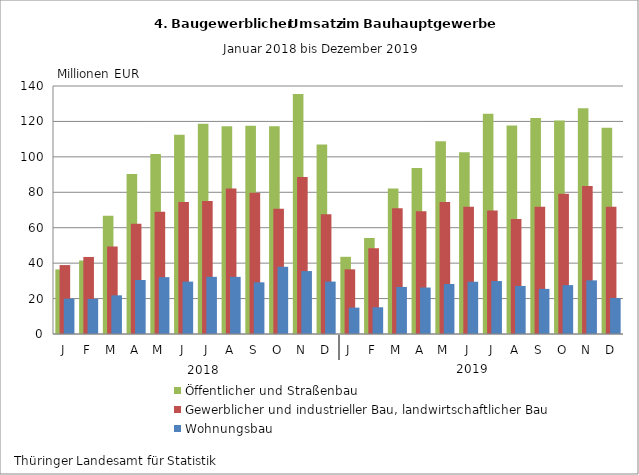
| Category | Öffentlicher und Straßenbau | Gewerblicher und industrieller Bau, landwirtschaftlicher Bau | Wohnungsbau |
|---|---|---|---|
| J | 36.461 | 38.916 | 19.944 |
| F | 41.492 | 43.491 | 19.799 |
| M | 66.813 | 49.453 | 21.838 |
| A | 90.351 | 62.298 | 30.492 |
| M | 101.624 | 69.039 | 32.082 |
| J | 112.47 | 74.496 | 29.577 |
| J | 118.718 | 75.073 | 32.275 |
| A | 117.344 | 82.106 | 32.252 |
| S | 117.631 | 79.749 | 29.178 |
| O | 117.283 | 70.656 | 37.951 |
| N | 135.53 | 88.631 | 35.534 |
| D | 106.993 | 67.575 | 29.583 |
| J | 43.577 | 36.503 | 14.894 |
| F | 54.231 | 48.423 | 15.079 |
| M | 82.117 | 70.999 | 26.584 |
| A | 93.712 | 69.355 | 26.237 |
| M | 108.75 | 74.527 | 28.236 |
| J | 102.548 | 71.806 | 29.507 |
| J | 124.393 | 69.699 | 29.893 |
| A | 117.692 | 64.926 | 27.134 |
| S | 121.961 | 71.829 | 25.473 |
| O | 120.583 | 79.112 | 27.59 |
| N | 127.409 | 83.579 | 30.274 |
| D | 116.474 | 71.868 | 20.344 |